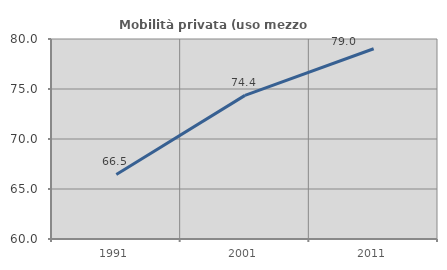
| Category | Mobilità privata (uso mezzo privato) |
|---|---|
| 1991.0 | 66.454 |
| 2001.0 | 74.361 |
| 2011.0 | 79.025 |